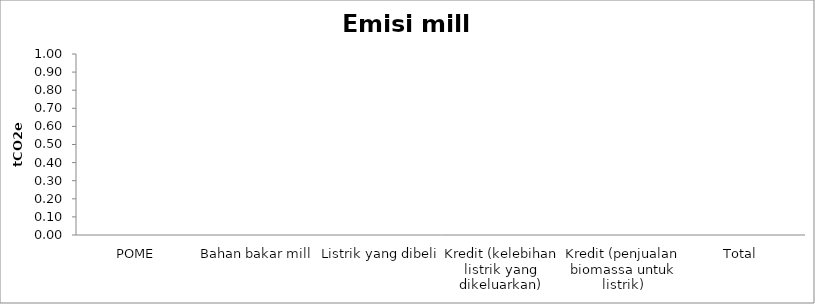
| Category | tCO2e |
|---|---|
| POME | 0 |
| Bahan bakar mill | 0 |
| Listrik yang dibeli | 0 |
| Kredit (kelebihan listrik yang dikeluarkan) | 0 |
| Kredit (penjualan biomassa untuk listrik) | 0 |
| Total  | 0 |